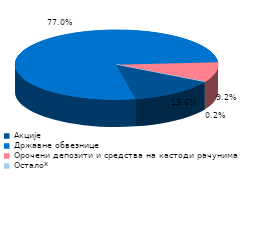
| Category | Series 0 |
|---|---|
| Акције | 0.136 |
| Државне обвезнице | 0.77 |
| Орочени депозити и средства на кастоди рачунима  | 0.092 |
| Остало* | 0.002 |